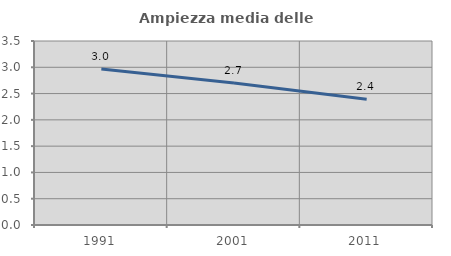
| Category | Ampiezza media delle famiglie |
|---|---|
| 1991.0 | 2.966 |
| 2001.0 | 2.702 |
| 2011.0 | 2.393 |